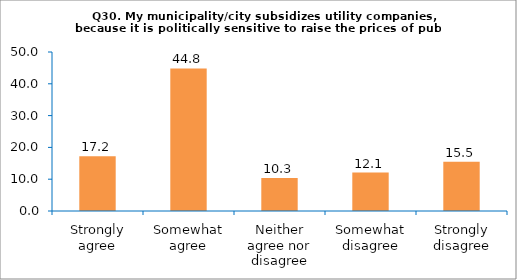
| Category | Series 0 |
|---|---|
| Strongly agree | 17.241 |
| Somewhat agree | 44.828 |
| Neither agree nor disagree | 10.345 |
| Somewhat disagree | 12.069 |
| Strongly disagree | 15.517 |